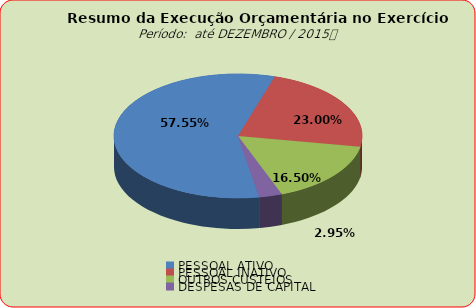
| Category | Series 0 |
|---|---|
| PESSOAL ATIVO | 130660574.9 |
| PESSOAL INATIVO | 52208759.17 |
| OUTROS CUSTEIOS | 37457898.14 |
| DESPESAS DE CAPITAL | 6696349.11 |